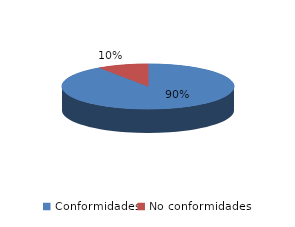
| Category | Series 0 |
|---|---|
| Conformidades | 1589 |
| No conformidades | 167 |